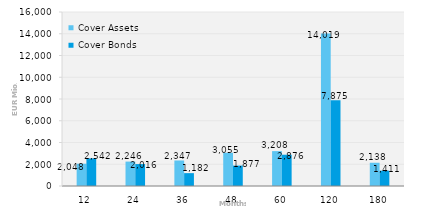
| Category | Cover Assets | Cover Bonds |
|---|---|---|
| 12.0 | 2048.3 | 2542.4 |
| 24.0 | 2246.2 | 2015.7 |
| 36.0 | 2346.6 | 1182 |
| 48.0 | 3054.5 | 1877 |
| 60.0 | 3208 | 2875.5 |
| 120.0 | 14018.6 | 7875 |
| 180.0 | 2138.4 | 1411 |